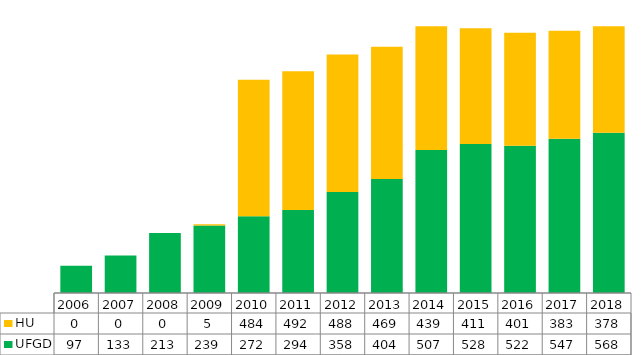
| Category | UFGD | HU |
|---|---|---|
| 2006.0 | 97 | 0 |
| 2007.0 | 133 | 0 |
| 2008.0 | 213 | 0 |
| 2009.0 | 239 | 5 |
| 2010.0 | 272 | 484 |
| 2011.0 | 294 | 492 |
| 2012.0 | 358 | 488 |
| 2013.0 | 404 | 469 |
| 2014.0 | 507 | 439 |
| 2015.0 | 528 | 411 |
| 2016.0 | 522 | 401 |
| 2017.0 | 547 | 383 |
| 2018.0 | 568 | 378 |